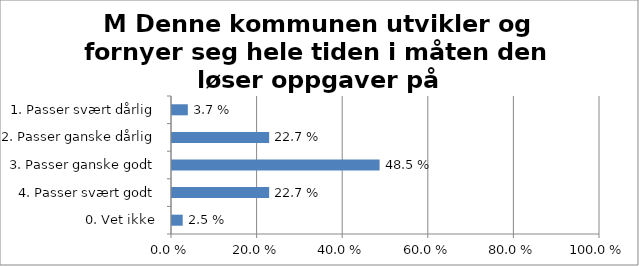
| Category | M Denne kommunen utvikler og fornyer seg hele tiden i måten den løser oppgaver på |
|---|---|
| 1. Passer svært dårlig | 0.037 |
| 2. Passer ganske dårlig | 0.227 |
| 3. Passer ganske godt | 0.485 |
| 4. Passer svært godt | 0.227 |
| 0. Vet ikke | 0.025 |